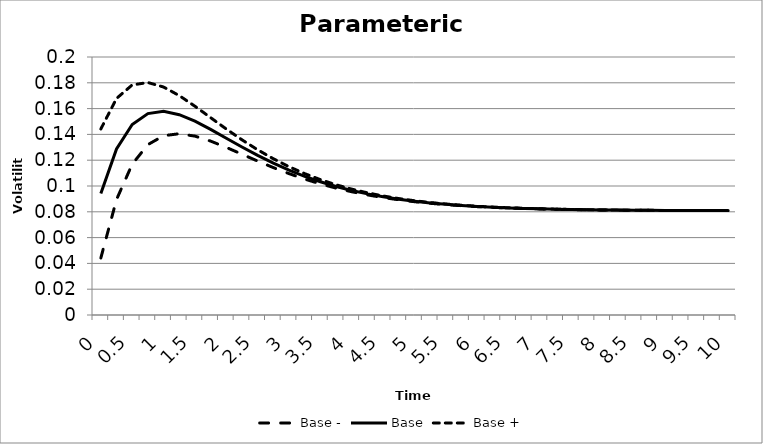
| Category | Base - | Base | Base + |
|---|---|---|---|
| 0.0 | 0.044 | 0.094 | 0.144 |
| 0.25 | 0.089 | 0.129 | 0.168 |
| 0.5 | 0.117 | 0.148 | 0.178 |
| 0.75 | 0.132 | 0.156 | 0.18 |
| 1.0 | 0.139 | 0.158 | 0.177 |
| 1.25 | 0.141 | 0.155 | 0.17 |
| 1.5 | 0.139 | 0.15 | 0.162 |
| 1.75 | 0.135 | 0.144 | 0.153 |
| 2.0 | 0.13 | 0.137 | 0.144 |
| 2.25 | 0.125 | 0.13 | 0.136 |
| 2.5 | 0.119 | 0.124 | 0.128 |
| 2.75 | 0.114 | 0.118 | 0.121 |
| 3.0 | 0.11 | 0.112 | 0.115 |
| 3.25 | 0.105 | 0.107 | 0.11 |
| 3.5 | 0.102 | 0.103 | 0.105 |
| 3.75 | 0.098 | 0.1 | 0.101 |
| 4.0 | 0.096 | 0.097 | 0.098 |
| 4.25 | 0.093 | 0.094 | 0.095 |
| 4.5 | 0.091 | 0.092 | 0.092 |
| 4.75 | 0.089 | 0.09 | 0.09 |
| 5.0 | 0.088 | 0.088 | 0.089 |
| 5.25 | 0.087 | 0.087 | 0.087 |
| 5.5 | 0.086 | 0.086 | 0.086 |
| 5.75 | 0.085 | 0.085 | 0.085 |
| 6.0 | 0.084 | 0.084 | 0.084 |
| 6.25 | 0.083 | 0.084 | 0.084 |
| 6.5 | 0.083 | 0.083 | 0.083 |
| 6.75 | 0.083 | 0.083 | 0.083 |
| 7.0 | 0.082 | 0.082 | 0.082 |
| 7.25 | 0.082 | 0.082 | 0.082 |
| 7.5 | 0.082 | 0.082 | 0.082 |
| 7.75 | 0.082 | 0.082 | 0.082 |
| 8.0 | 0.081 | 0.081 | 0.081 |
| 8.25 | 0.081 | 0.081 | 0.081 |
| 8.5 | 0.081 | 0.081 | 0.081 |
| 8.75 | 0.081 | 0.081 | 0.081 |
| 9.0 | 0.081 | 0.081 | 0.081 |
| 9.25 | 0.081 | 0.081 | 0.081 |
| 9.5 | 0.081 | 0.081 | 0.081 |
| 9.75 | 0.081 | 0.081 | 0.081 |
| 10.0 | 0.081 | 0.081 | 0.081 |